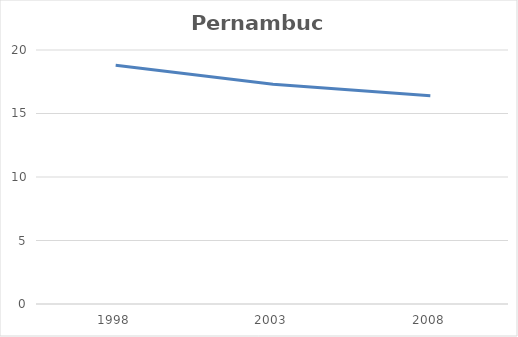
| Category | Pernambuco |
|---|---|
| 1998.0 | 18.8 |
| 2003.0 | 17.3 |
| 2008.0 | 16.4 |